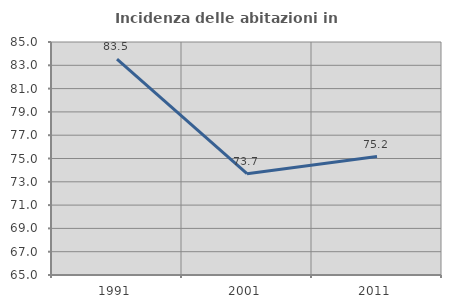
| Category | Incidenza delle abitazioni in proprietà  |
|---|---|
| 1991.0 | 83.529 |
| 2001.0 | 73.696 |
| 2011.0 | 75.168 |